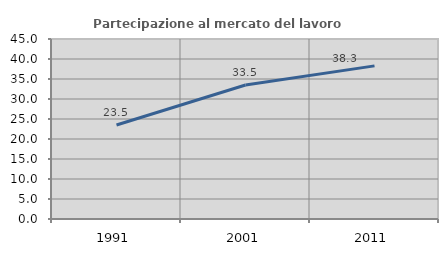
| Category | Partecipazione al mercato del lavoro  femminile |
|---|---|
| 1991.0 | 23.509 |
| 2001.0 | 33.505 |
| 2011.0 | 38.28 |